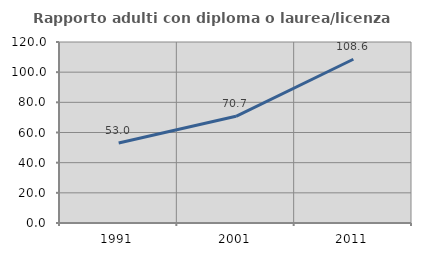
| Category | Rapporto adulti con diploma o laurea/licenza media  |
|---|---|
| 1991.0 | 53.043 |
| 2001.0 | 70.737 |
| 2011.0 | 108.571 |